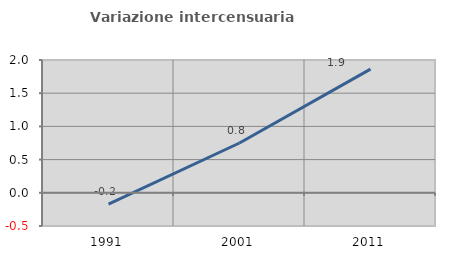
| Category | Variazione intercensuaria annua |
|---|---|
| 1991.0 | -0.172 |
| 2001.0 | 0.75 |
| 2011.0 | 1.862 |